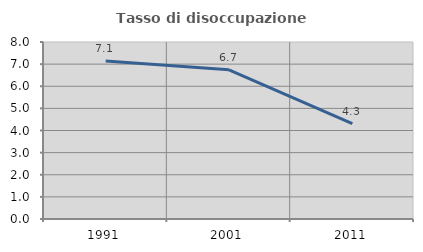
| Category | Tasso di disoccupazione giovanile  |
|---|---|
| 1991.0 | 7.143 |
| 2001.0 | 6.744 |
| 2011.0 | 4.313 |